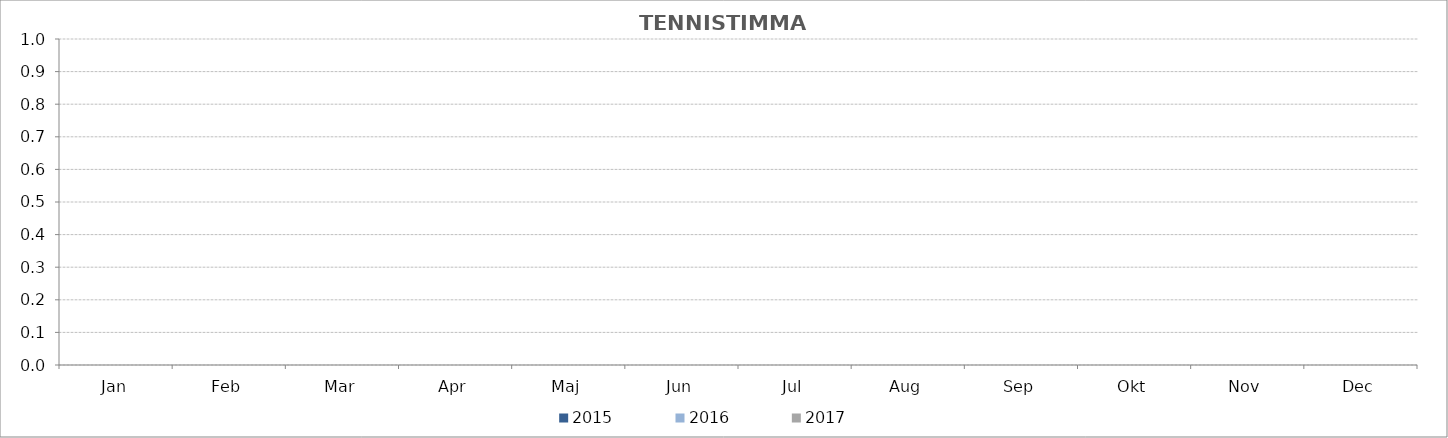
| Category | 2013 | 2014 | 2015 | 2016 | 2017 |
|---|---|---|---|---|---|
| Jan |  |  | 0 | 0 | 0 |
| Feb |  |  | 0 | 0 | 0 |
| Mar |  |  | 0 | 0 | 0 |
| Apr |  |  | 0 | 0 | 0 |
| Maj |  |  | 0 | 0 | 0 |
| Jun |  |  | 0 | 0 | 0 |
| Jul |  |  | 0 | 0 | 0 |
| Aug |  |  | 0 | 0 | 0 |
| Sep |  |  | 0 | 0 | 0 |
| Okt |  |  | 0 | 0 | 0 |
| Nov |  |  | 0 | 0 | 0 |
| Dec |  |  | 0 | 0 | 0 |